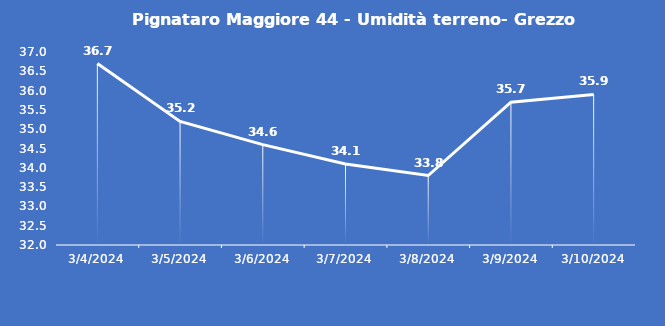
| Category | Pignataro Maggiore 44 - Umidità terreno- Grezzo (%VWC) |
|---|---|
| 3/4/24 | 36.7 |
| 3/5/24 | 35.2 |
| 3/6/24 | 34.6 |
| 3/7/24 | 34.1 |
| 3/8/24 | 33.8 |
| 3/9/24 | 35.7 |
| 3/10/24 | 35.9 |